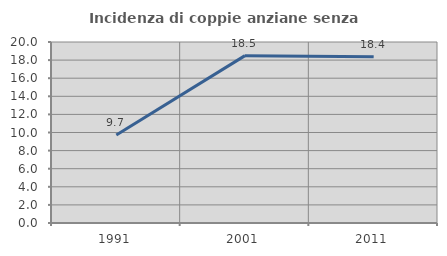
| Category | Incidenza di coppie anziane senza figli  |
|---|---|
| 1991.0 | 9.732 |
| 2001.0 | 18.493 |
| 2011.0 | 18.375 |